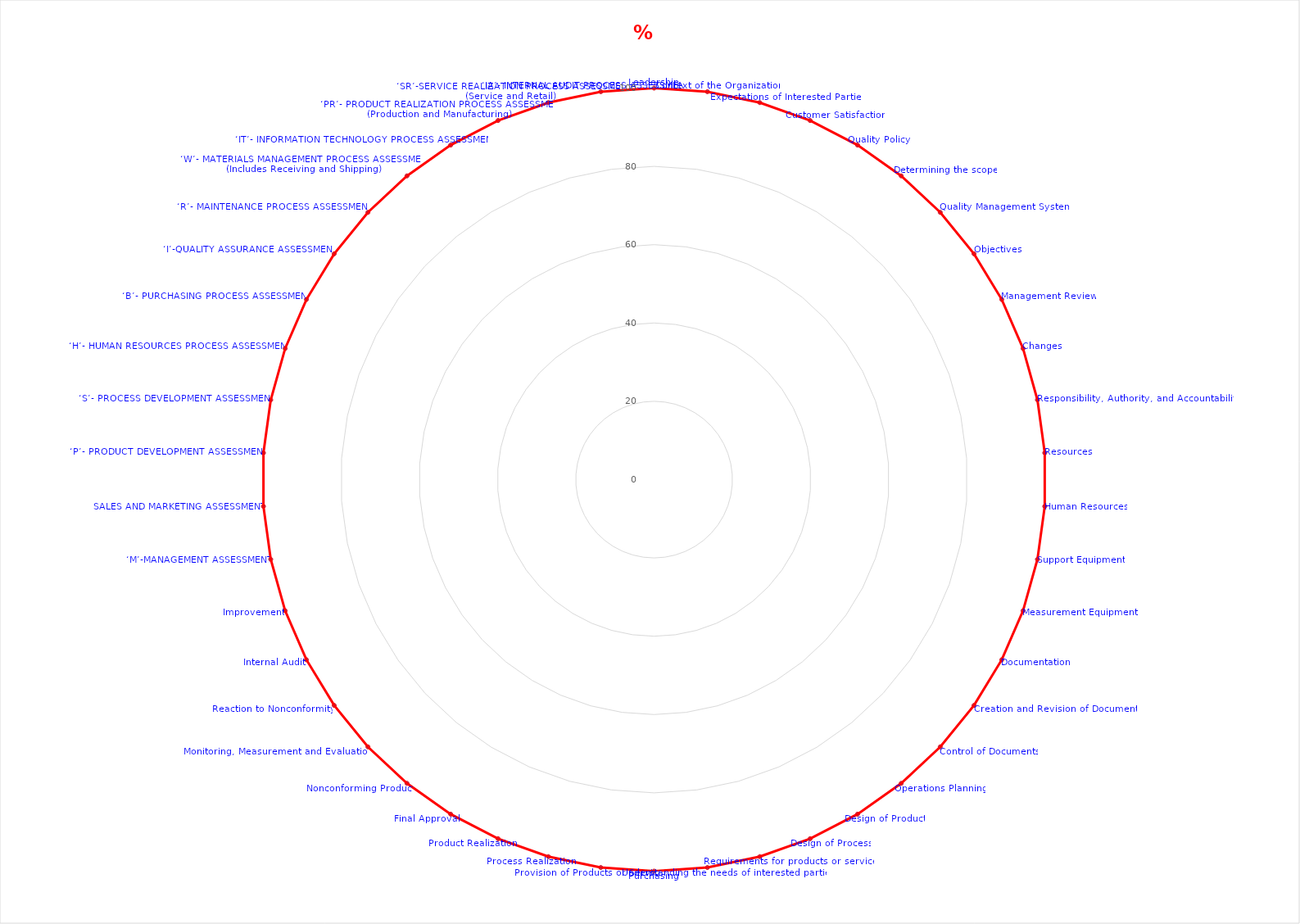
| Category | % Compliance |
|---|---|
| Leadership | 100 |
| Context of the Organization | 100 |
| Expectations of Interested Parties | 100 |
| Customer Satisfaction | 100 |
| Quality Policy | 100 |
| Determining the scope | 100 |
| Quality Management System | 100 |
| Objectives | 100 |
| Management Review | 100 |
| Changes | 100 |
| Responsibility, Authority, and Accountability | 100 |
| Resources | 100 |
| Human Resources | 100 |
| Support Equipment | 100 |
| Measurement Equipment  | 100 |
| Documentation | 100 |
| Creation and Revision of Documents | 100 |
| Control of Documents | 100 |
| Operations Planning | 100 |
| Design of Product | 100 |
| Design of Process | 100 |
| Requirements for products or services | 100 |
| Understanding the needs of interested parties | 100 |
| Purchasing | 100 |
| Provision of Products or Services | 100 |
| Process Realization  | 100 |
| Product Realization  | 100 |
| Final Approval | 100 |
| Nonconforming Product | 100 |
| Monitoring, Measurement and Evaluation | 100 |
| Reaction to Nonconformity | 100 |
| Internal Audit | 100 |
| Improvement | 100 |
| ‘M’-MANAGEMENT ASSESSMENT | 100 |
| SALES AND MARKETING ASSESSMENT | 100 |
| ‘P’- PRODUCT DEVELOPMENT ASSESSMENT | 100 |
| ‘S’- PROCESS DEVELOPMENT ASSESSMENT | 100 |
| ‘H’- HUMAN RESOURCES PROCESS ASSESSMENT | 100 |
| ‘B’- PURCHASING PROCESS ASSESSMENT | 100 |
| ‘I’-QUALITY ASSURANCE ASSESSMENT | 100 |
| ‘R’- MAINTENANCE PROCESS ASSESSMENT | 100 |
| ‘W’- MATERIALS MANAGEMENT PROCESS ASSESSMENT (Includes Receiving and Shipping) | 100 |
| ‘IT’- INFORMATION TECHNOLOGY PROCESS ASSESSMENT | 100 |
| ‘PR’- PRODUCT REALIZATION PROCESS ASSESSMENT (Production and Manufacturing) | 100 |
| ‘SR’-SERVICE REALIZATION PROCESS ASSESSMENT (Service and Retail) | 100 |
| ‘IA’- INTERNAL AUDIT PROCESS ASSESSMENT | 100 |